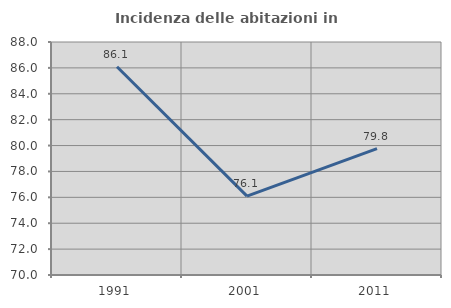
| Category | Incidenza delle abitazioni in proprietà  |
|---|---|
| 1991.0 | 86.09 |
| 2001.0 | 76.098 |
| 2011.0 | 79.763 |